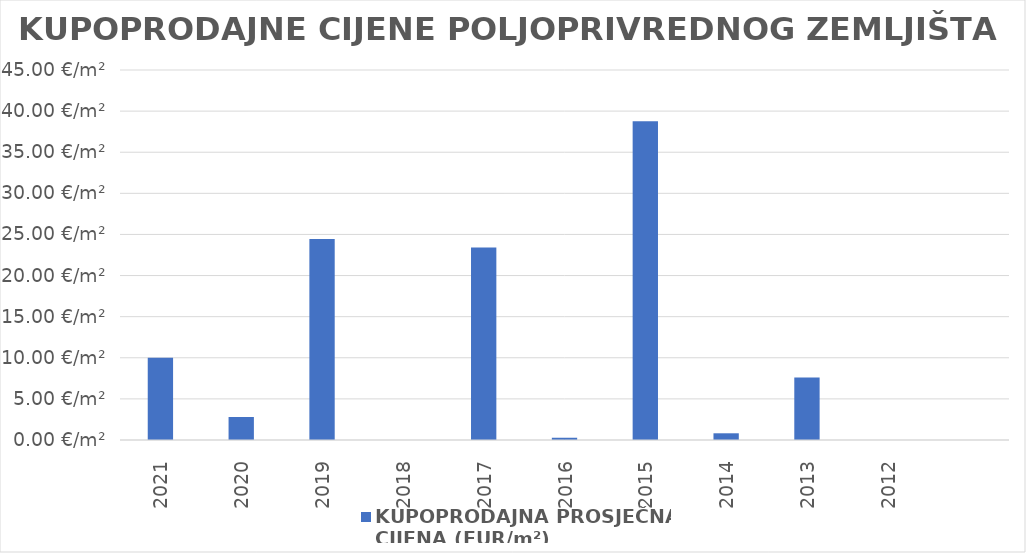
| Category | KUPOPRODAJNA PROSJEČNA 
CIJENA (EUR/m²) |
|---|---|
| 2021 | 1900-01-10 00:17:15 |
| 2020 | 1900-01-02 19:07:05 |
| 2019 | 1900-01-24 10:49:49 |
| 2018 | 0 |
| 2017 | 1900-01-23 09:40:12 |
| 2016 | 0.274 |
| 2015 | 1900-02-07 18:03:40 |
| 2014 | 0.816 |
| 2013 | 1900-01-07 14:20:43 |
| 2012 | 0 |